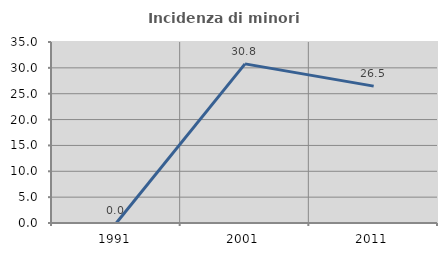
| Category | Incidenza di minori stranieri |
|---|---|
| 1991.0 | 0 |
| 2001.0 | 30.769 |
| 2011.0 | 26.471 |